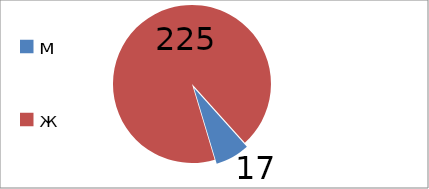
| Category | Series 0 |
|---|---|
| м | 17 |
| ж | 225 |